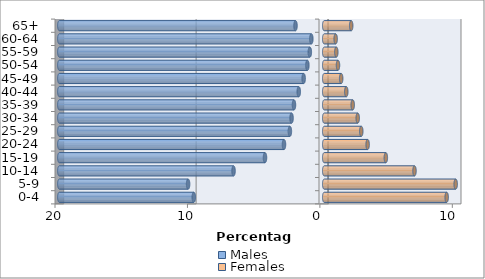
| Category | Males | Females |
|---|---|---|
| 0-4 | -9.849 | 9.247 |
| 5-9 | -10.278 | 9.926 |
| 10-14 | -6.847 | 6.816 |
| 15-19 | -4.472 | 4.652 |
| 20-24 | -3.037 | 3.279 |
| 25-29 | -2.592 | 2.798 |
| 30-34 | -2.466 | 2.529 |
| 35-39 | -2.284 | 2.152 |
| 40-44 | -1.922 | 1.666 |
| 45-49 | -1.553 | 1.281 |
| 50-54 | -1.271 | 1.04 |
| 55-59 | -1.087 | 0.913 |
| 60-64 | -0.973 | 0.864 |
| 65+ | -2.168 | 2.038 |